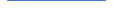
| Category | Series 0 |
|---|---|
| 0 | 127 |
| 1 | 91 |
| 2 | 58 |
| 3 | 74 |
| 4 | 73 |
| 5 | 69 |
| 6 | 79 |
| 7 | 51 |
| 8 | 72 |